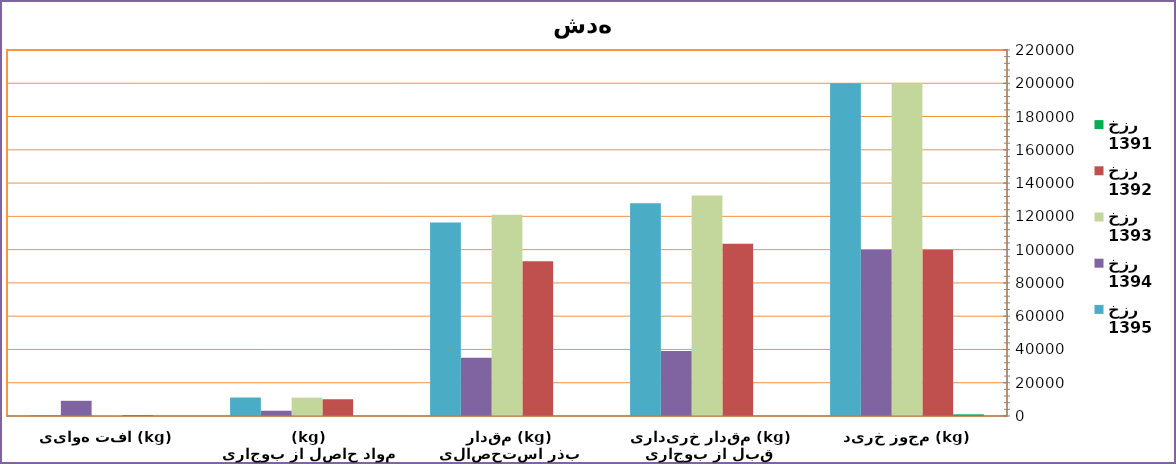
| Category | 1391 خزر | 1392 خزر | 1393 خزر | 1394 خزر | 1395 خزر |
|---|---|---|---|---|---|
| مجوز خرید (kg) | 1000 | 100000 | 200000 | 100000 | 200000 |
| مقدار خریداری قبل از بوجاری (kg) | 0 | 103565 | 132584 | 39032 | 127935 |
| مقدار بذر استحصالی قابل توزیع (kg) | 0 | 92970 | 120990 | 34950 | 116240 |
| مواد حاصل از بوجاری (kg) | 0 | 10085 | 11055 | 3168 | 11113 |
| افت هوایی (kg) | 0 | 510 | 390 | 9140 | 582 |